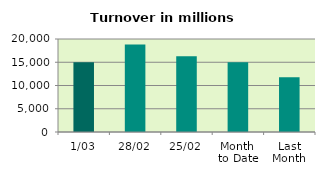
| Category | Series 0 |
|---|---|
| 1/03 | 15000.134 |
| 28/02 | 18805.913 |
| 25/02 | 16304.94 |
| Month 
to Date | 15000.134 |
| Last
Month | 11787.675 |